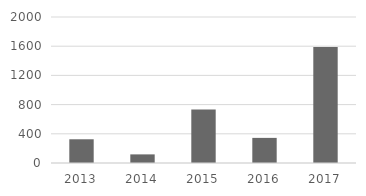
| Category | Series 0 |
|---|---|
| 2013.0 | 325 |
| 2014.0 | 118 |
| 2015.0 | 733 |
| 2016.0 | 344 |
| 2017.0 | 1589 |